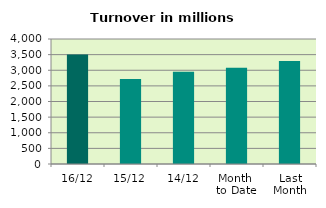
| Category | Series 0 |
|---|---|
| 16/12 | 3503.47 |
| 15/12 | 2722.1 |
| 14/12 | 2949.731 |
| Month 
to Date | 3079.982 |
| Last
Month | 3292.145 |